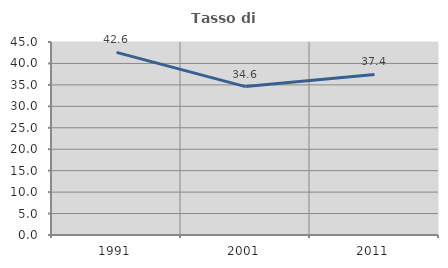
| Category | Tasso di occupazione   |
|---|---|
| 1991.0 | 42.577 |
| 2001.0 | 34.601 |
| 2011.0 | 37.432 |